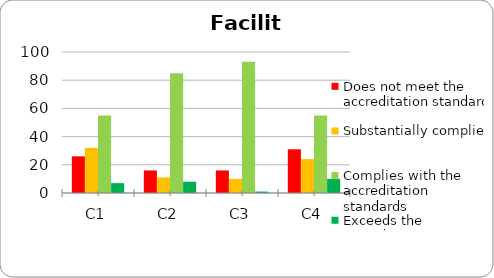
| Category | Does not meet the accreditation standard | Substantially complies | Complies with the accreditation standards | Exceeds the accreditation standards |
|---|---|---|---|---|
| C1 | 26 | 32 | 55 | 7 |
| C2 | 16 | 11 | 85 | 8 |
| C3 | 16 | 10 | 93 | 1 |
| C4 | 31 | 24 | 55 | 10 |